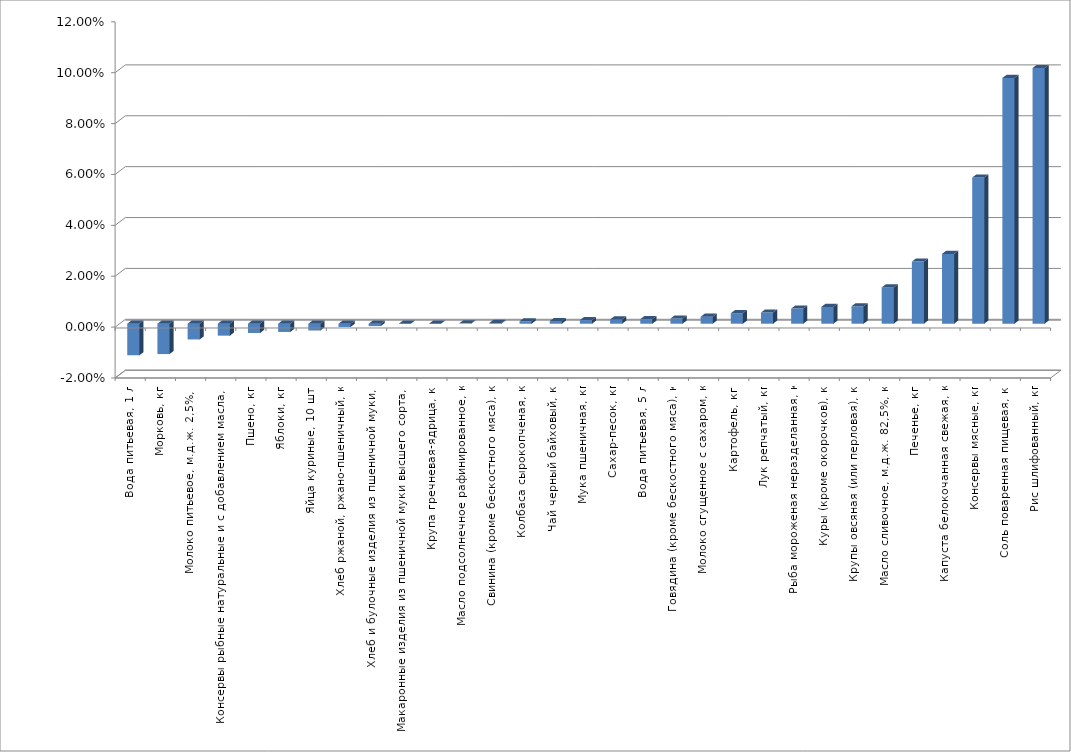
| Category | Series 0 |
|---|---|
| Вода питьевая, 1 л | -0.012 |
| Морковь, кг | -0.012 |
| Молоко питьевое, м.д.ж. 2,5%, л | -0.006 |
| Консервы рыбные натуральные и с добавлением масла, кг | -0.005 |
| Пшено, кг | -0.004 |
| Яблоки, кг | -0.003 |
| Яйца куриные, 10 шт. | -0.003 |
| Хлеб ржаной, ржано-пшеничный, кг | -0.001 |
| Хлеб и булочные изделия из пшеничной муки, кг | -0.001 |
| Макаронные изделия из пшеничной муки высшего сорта, кг | 0 |
| Крупа гречневая-ядрица, кг | 0 |
| Масло подсолнечное рафинированное, кг | 0 |
| Свинина (кроме бескостного мяса), кг | 0 |
| Колбаса сырокопченая, кг | 0.001 |
| Чай черный байховый, кг | 0.001 |
| Мука пшеничная, кг | 0.001 |
| Сахар-песок, кг | 0.002 |
| Вода питьевая, 5 л | 0.002 |
| Говядина (кроме бескостного мяса), кг | 0.002 |
| Молоко сгущенное с сахаром, кг | 0.003 |
| Картофель, кг | 0.004 |
| Лук репчатый, кг | 0.004 |
| Рыба мороженая неразделанная, кг | 0.006 |
| Куры (кроме окорочков), кг | 0.007 |
| Крупы овсяная (или перловая), кг | 0.007 |
| Масло сливочное, м.д.ж. 82,5%, кг | 0.014 |
| Печенье, кг | 0.024 |
| Капуста белокочанная свежая, кг | 0.027 |
| Консервы мясные, кг | 0.057 |
| Соль поваренная пищевая, кг | 0.097 |
| Рис шлифованный, кг | 0.1 |